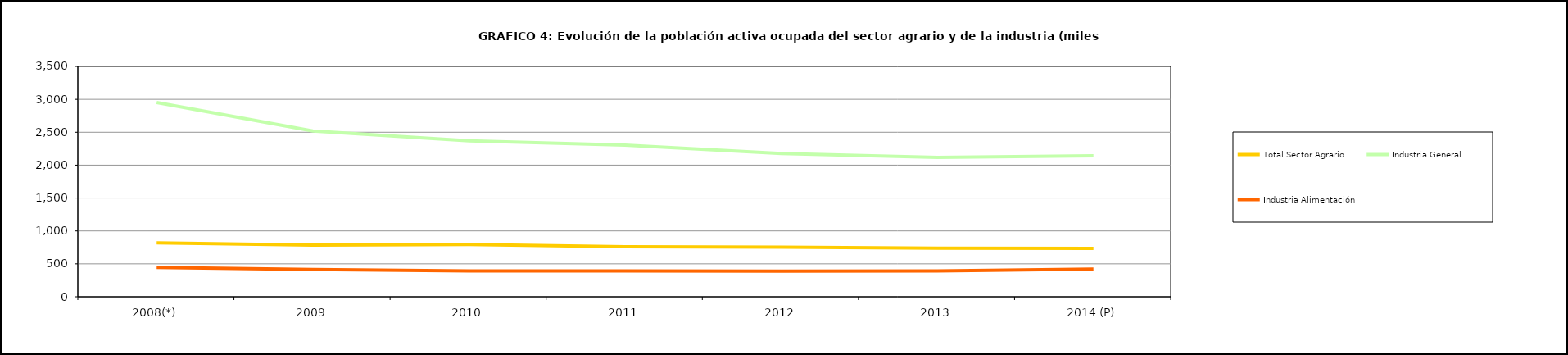
| Category | Total Sector Agrario  | Industria General | Industria Alimentación |
|---|---|---|---|
| 2008(*) | 818.9 | 2951.775 | 445.675 |
| 2009 | 786.05 | 2519.475 | 415.6 |
| 2010 | 792.975 | 2370.1 | 392.275 |
| 2011 | 760.15 | 2304.9 | 393.05 |
| 2012 | 753.225 | 2175.575 | 388.925 |
| 2013 | 736.6 | 2118.7 | 393.3 |
| 2014 (P) | 735.85 | 2141.4 | 420.65 |